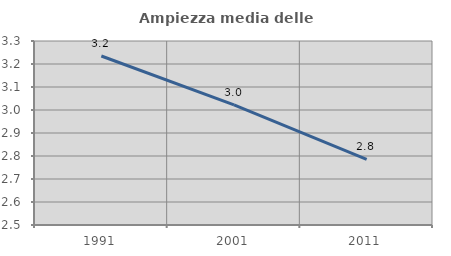
| Category | Ampiezza media delle famiglie |
|---|---|
| 1991.0 | 3.235 |
| 2001.0 | 3.022 |
| 2011.0 | 2.785 |